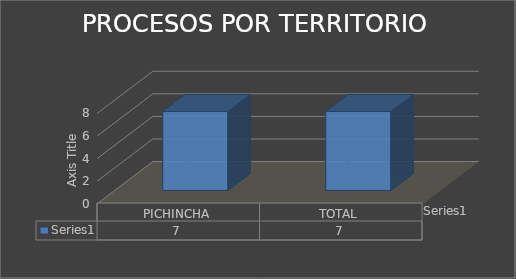
| Category | Series 0 |
|---|---|
| PICHINCHA | 7 |
| TOTAL | 7 |